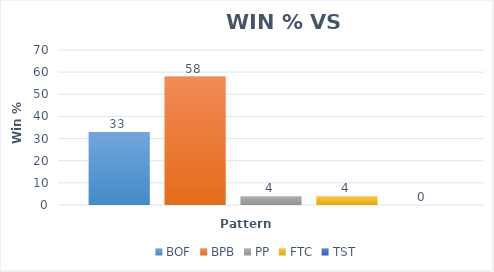
| Category | BOF | BPB | PP | FTC | TST |
|---|---|---|---|---|---|
| % of Total Gain | 33 | 58 | 4 | 4 | 0 |